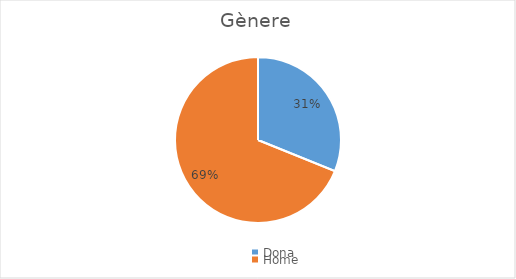
| Category | Series 0 |
|---|---|
| Dona | 14 |
| Home | 31 |